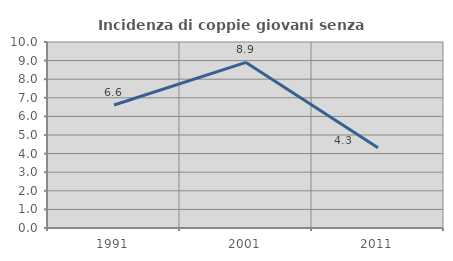
| Category | Incidenza di coppie giovani senza figli |
|---|---|
| 1991.0 | 6.612 |
| 2001.0 | 8.901 |
| 2011.0 | 4.317 |